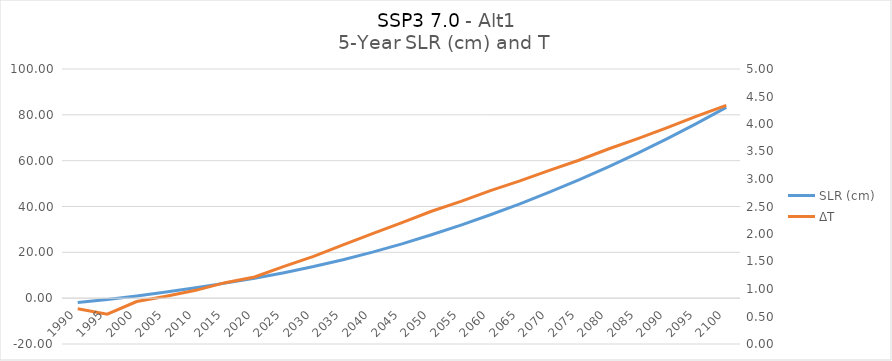
| Category | SLR (cm) |
|---|---|
| 1990.0 | -1.853 |
| 1995.0 | -0.626 |
| 2000.0 | 0.958 |
| 2005.0 | 2.678 |
| 2010.0 | 4.531 |
| 2015.0 | 6.565 |
| 2020.0 | 8.703 |
| 2025.0 | 11.118 |
| 2030.0 | 13.794 |
| 2035.0 | 16.789 |
| 2040.0 | 20.098 |
| 2045.0 | 23.715 |
| 2050.0 | 27.657 |
| 2055.0 | 31.868 |
| 2060.0 | 36.385 |
| 2065.0 | 41.166 |
| 2070.0 | 46.247 |
| 2075.0 | 51.609 |
| 2080.0 | 57.303 |
| 2085.0 | 63.293 |
| 2090.0 | 69.606 |
| 2095.0 | 76.265 |
| 2100.0 | 83.24 |